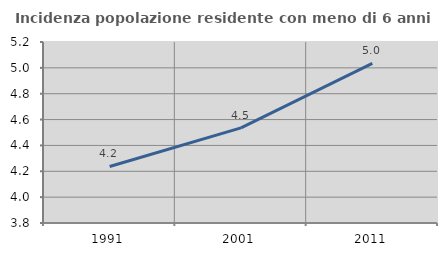
| Category | Incidenza popolazione residente con meno di 6 anni |
|---|---|
| 1991.0 | 4.237 |
| 2001.0 | 4.536 |
| 2011.0 | 5.035 |